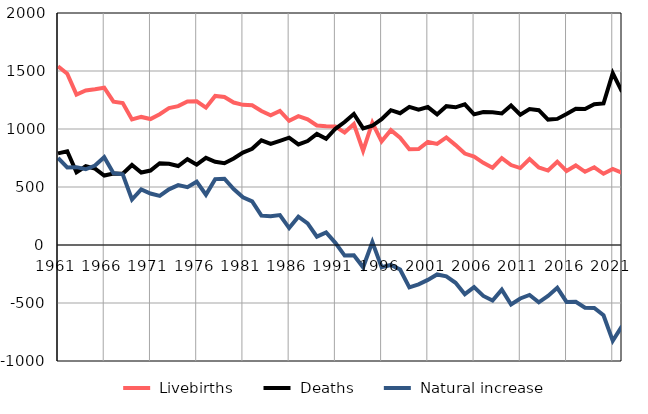
| Category |  Livebirths |  Deaths |  Natural increase |
|---|---|---|---|
| 1961.0 | 1540 | 790 | 750 |
| 1962.0 | 1477 | 808 | 669 |
| 1963.0 | 1297 | 626 | 671 |
| 1964.0 | 1332 | 679 | 653 |
| 1965.0 | 1343 | 658 | 685 |
| 1966.0 | 1356 | 599 | 757 |
| 1967.0 | 1236 | 617 | 619 |
| 1968.0 | 1223 | 614 | 609 |
| 1969.0 | 1082 | 690 | 392 |
| 1970.0 | 1104 | 625 | 479 |
| 1971.0 | 1086 | 642 | 444 |
| 1972.0 | 1128 | 705 | 423 |
| 1973.0 | 1180 | 700 | 480 |
| 1974.0 | 1197 | 681 | 516 |
| 1975.0 | 1238 | 740 | 498 |
| 1976.0 | 1239 | 693 | 546 |
| 1977.0 | 1184 | 751 | 433 |
| 1978.0 | 1285 | 717 | 568 |
| 1979.0 | 1276 | 705 | 571 |
| 1980.0 | 1228 | 746 | 482 |
| 1981.0 | 1208 | 797 | 411 |
| 1982.0 | 1205 | 829 | 376 |
| 1983.0 | 1155 | 902 | 253 |
| 1984.0 | 1118 | 871 | 247 |
| 1985.0 | 1156 | 898 | 258 |
| 1986.0 | 1071 | 925 | 146 |
| 1987.0 | 1111 | 867 | 244 |
| 1988.0 | 1083 | 896 | 187 |
| 1989.0 | 1030 | 958 | 72 |
| 1990.0 | 1023 | 915 | 108 |
| 1991.0 | 1021 | 1002 | 19 |
| 1992.0 | 969 | 1060 | -91 |
| 1993.0 | 1042 | 1130 | -88 |
| 1994.0 | 813 | 1005 | -192 |
| 1995.0 | 1054 | 1028 | 26 |
| 1996.0 | 894 | 1085 | -191 |
| 1997.0 | 990 | 1162 | -172 |
| 1998.0 | 925 | 1136 | -211 |
| 1999.0 | 826 | 1191 | -365 |
| 2000.0 | 827 | 1166 | -339 |
| 2001.0 | 888 | 1189 | -301 |
| 2002.0 | 872 | 1126 | -254 |
| 2003.0 | 927 | 1197 | -270 |
| 2004.0 | 861 | 1187 | -326 |
| 2005.0 | 788 | 1212 | -424 |
| 2006.0 | 763 | 1126 | -363 |
| 2007.0 | 708 | 1147 | -439 |
| 2008.0 | 666 | 1144 | -478 |
| 2009.0 | 749 | 1134 | -385 |
| 2010.0 | 689 | 1202 | -513 |
| 2011.0 | 663 | 1124 | -461 |
| 2012.0 | 741 | 1172 | -431 |
| 2013.0 | 668 | 1162 | -494 |
| 2014.0 | 642 | 1081 | -439 |
| 2015.0 | 718 | 1087 | -369 |
| 2016.0 | 638 | 1129 | -491 |
| 2017.0 | 686 | 1175 | -489 |
| 2018.0 | 631 | 1172 | -541 |
| 2019.0 | 670 | 1213 | -543 |
| 2020.0 | 614 | 1220 | -606 |
| 2021.0 | 656 | 1482 | -826 |
| 2022.0 | 623 | 1322 | -699 |